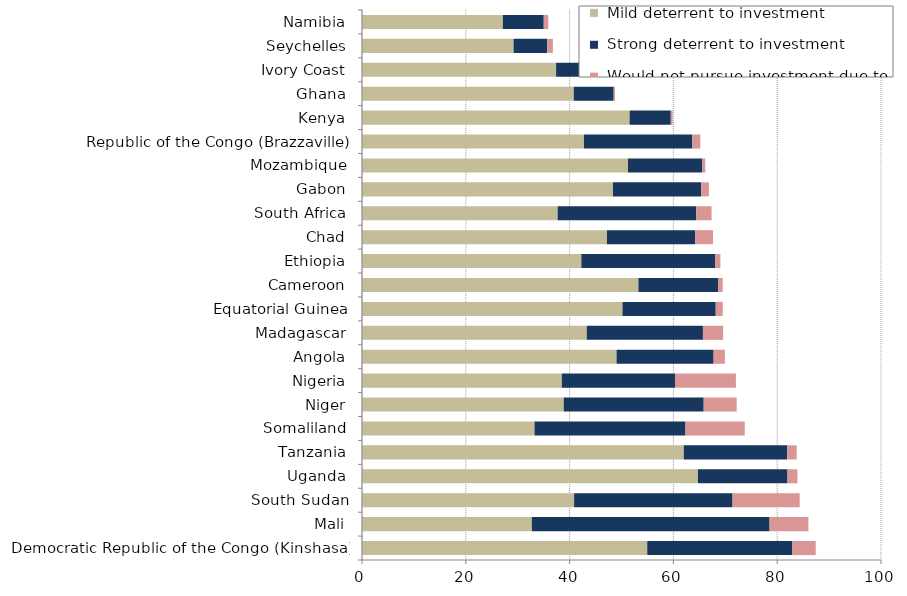
| Category |  Mild deterrent to investment |  Strong deterrent to investment |  Would not pursue investment due to this factor |
|---|---|---|---|
| Democratic Republic of the Congo (Kinshasa) | 54.954 | 27.976 | 4.496 |
| Mali | 32.723 | 45.812 | 7.479 |
| South Sudan | 40.871 | 30.524 | 12.934 |
| Uganda | 64.726 | 17.26 | 1.918 |
| Tanzania | 62.001 | 19.942 | 1.813 |
| Somaliland | 33.242 | 29.087 | 11.427 |
| Niger | 38.87 | 26.971 | 6.346 |
| Nigeria | 38.497 | 21.815 | 11.732 |
| Angola | 49.05 | 18.699 | 2.168 |
| Madagascar | 43.306 | 22.383 | 3.893 |
| Equatorial Guinea | 50.186 | 17.972 | 1.356 |
| Cameroon | 53.259 | 15.346 | 0.903 |
| Ethiopia | 42.256 | 25.766 | 1.031 |
| Chad | 47.198 | 17.03 | 3.406 |
| South Africa | 37.7 | 26.686 | 2.965 |
| Gabon | 48.358 | 16.979 | 1.504 |
| Mozambique | 51.254 | 14.329 | 0.551 |
| Republic of the Congo (Brazzaville) | 42.761 | 20.859 | 1.564 |
| Kenya | 51.563 | 7.933 | 0.361 |
| Ghana | 40.804 | 7.684 | 0.265 |
| Ivory Coast | 37.397 | 8.601 | 0.748 |
| Seychelles | 29.207 | 6.49 | 1.082 |
| Namibia | 27.141 | 7.88 | 0.876 |